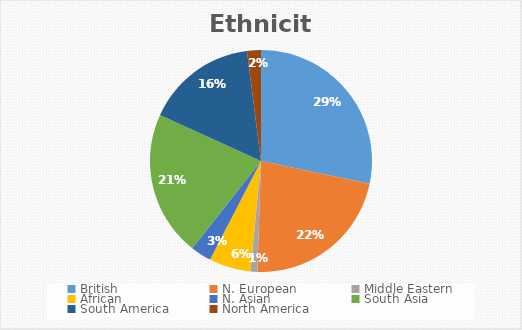
| Category | Series 0 |
|---|---|
| British  | 0.283 |
| N. European  | 0.222 |
| Middle Eastern  | 0.01 |
| African  | 0.061 |
| N. Asian  | 0.03 |
| South Asia  | 0.212 |
| South America  | 0.162 |
| North America  | 0.02 |